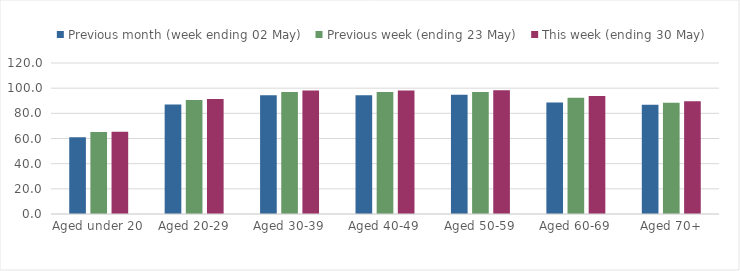
| Category | Previous month (week ending 02 May) | Previous week (ending 23 May) | This week (ending 30 May) |
|---|---|---|---|
| Aged under 20 | 60.964 | 65.186 | 65.319 |
| Aged 20-29 | 86.922 | 90.542 | 91.428 |
| Aged 30-39 | 94.31 | 96.891 | 98.232 |
| Aged 40-49 | 94.298 | 96.871 | 98.226 |
| Aged 50-59 | 94.703 | 96.916 | 98.381 |
| Aged 60-69 | 88.635 | 92.402 | 93.808 |
| Aged 70+ | 86.779 | 88.341 | 89.583 |